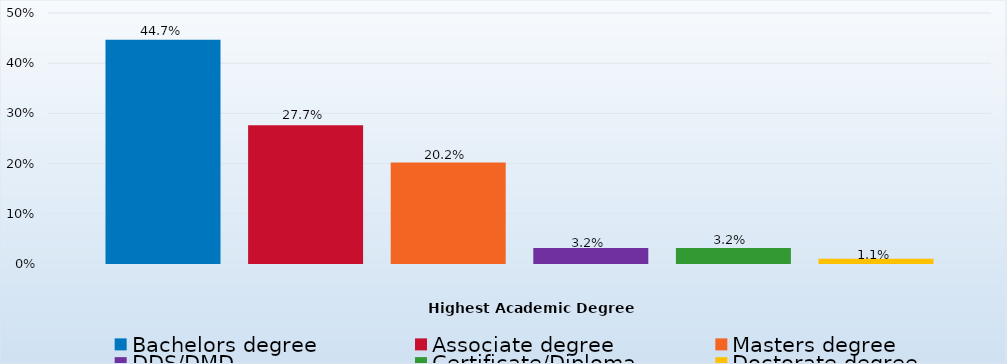
| Category | Bachelors degree | Associate degree | Masters degree | DDS/DMD | Certificate/Diploma | Doctorate degree |
|---|---|---|---|---|---|---|
| Percent | 0.447 | 0.277 | 0.202 | 0.032 | 0.032 | 0.011 |